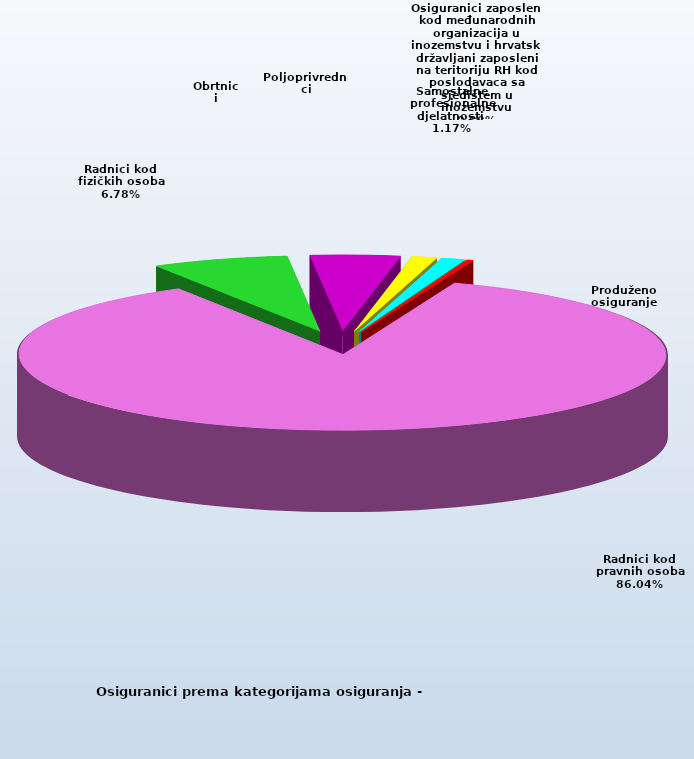
| Category | Series 0 |
|---|---|
| Radnici kod pravnih osoba | 1332897 |
| Radnici kod fizičkih osoba | 105080 |
| Obrtnici | 69065 |
| Poljoprivrednici | 19164 |
| Samostalne profesionalne djelatnosti  | 18150 |
| Osiguranici zaposleni kod međunarodnih organizacija u inozemstvu i hrvatski državljani zaposleni na teritoriju RH kod poslodavaca sa sjedištem u inozemstvu | 75 |
| Produženo osiguranje | 4646 |